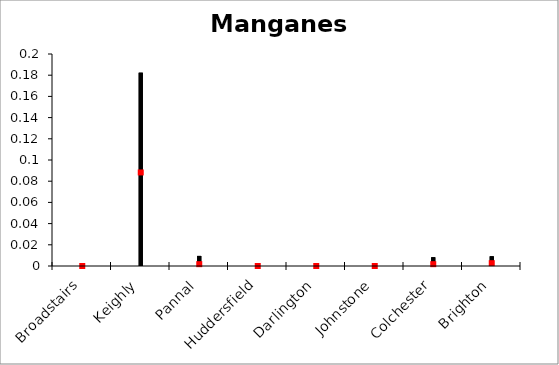
| Category | Lead | Series 1 | Series 2 |
|---|---|---|---|
| Broadstairs | 0.001 | 0 | 0 |
| Keighly | 0.182 | 0 | 0.088 |
| Pannal | 0.01 | 0 | 0.002 |
| Huddersfield | 0 | 0 | 0 |
| Darlington | 0.001 | 0 | 0 |
| Johnstone | 0 | 0 | 0 |
| Colchester | 0.008 | 0 | 0.002 |
| Brighton | 0.009 | 0 | 0.003 |